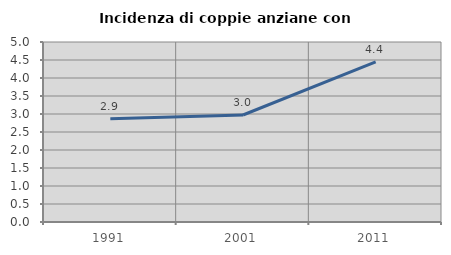
| Category | Incidenza di coppie anziane con figli |
|---|---|
| 1991.0 | 2.869 |
| 2001.0 | 2.972 |
| 2011.0 | 4.45 |